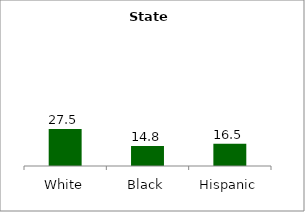
| Category | Series 0 |
|---|---|
| White | 27.491 |
| Black | 14.764 |
| Hispanic | 16.463 |